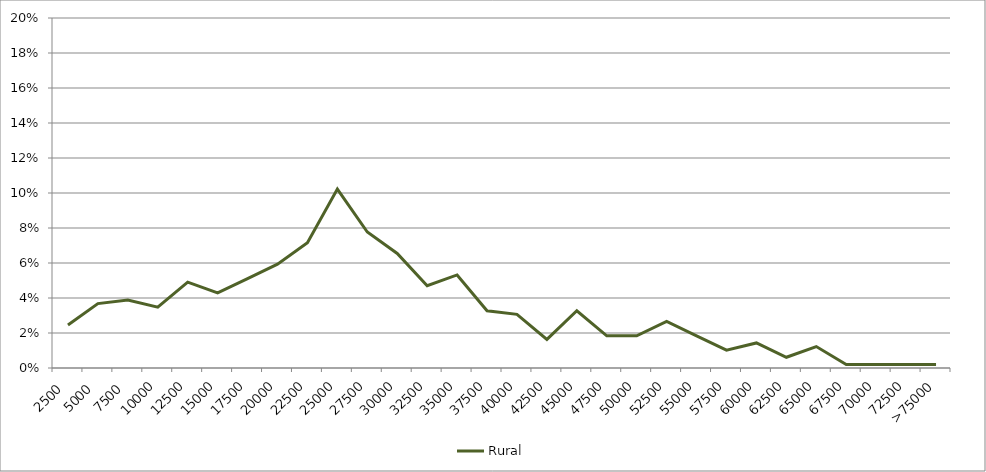
| Category | Rural |
|---|---|
| 2500 | 0.025 |
| 5000 | 0.037 |
| 7500 | 0.039 |
| 10000 | 0.035 |
| 12500 | 0.049 |
| 15000 | 0.043 |
| 17500 | 0.051 |
| 20000 | 0.059 |
| 22500 | 0.072 |
| 25000 | 0.102 |
| 27500 | 0.078 |
| 30000 | 0.065 |
| 32500 | 0.047 |
| 35000 | 0.053 |
| 37500 | 0.033 |
| 40000 | 0.031 |
| 42500 | 0.016 |
| 45000 | 0.033 |
| 47500 | 0.018 |
| 50000 | 0.018 |
| 52500 | 0.027 |
| 55000 | 0.018 |
| 57500 | 0.01 |
| 60000 | 0.014 |
| 62500 | 0.006 |
| 65000 | 0.012 |
| 67500 | 0.002 |
| 70000 | 0.002 |
| 72500 | 0.002 |
| >75000 | 0.002 |